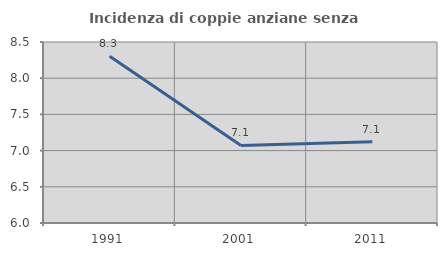
| Category | Incidenza di coppie anziane senza figli  |
|---|---|
| 1991.0 | 8.303 |
| 2001.0 | 7.071 |
| 2011.0 | 7.121 |